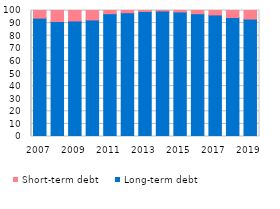
| Category | Long-term debt | Short-term debt |
|---|---|---|
| 2007 | 93.994 | 6.006 |
| 2008 | 91.269 | 8.731 |
| 2009 | 91.683 | 8.317 |
| 2010 | 92.524 | 7.476 |
| 2011 | 97.465 | 2.535 |
| 2012 | 98.226 | 1.774 |
| 2013 | 99.234 | 0.766 |
| 2014 | 99.616 | 0.384 |
| 2015 | 98.846 | 1.154 |
| 2016 | 97.448 | 2.552 |
| 2017 | 96.488 | 3.512 |
| 2018 | 94.424 | 5.576 |
| 2019 | 93.212 | 6.788 |